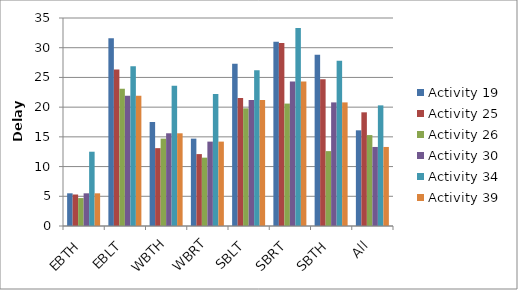
| Category | Activity 19 | Activity 25 | Activity 26 | Activity 30 | Activity 34 | Activity 39 |
|---|---|---|---|---|---|---|
| EBTH | 5.5 | 5.3 | 4.7 | 5.5 | 12.5 | 5.5 |
| EBLT | 31.6 | 26.35 | 23.1 | 21.9 | 26.9 | 21.9 |
| WBTH | 17.5 | 13.1 | 14.7 | 15.6 | 23.6 | 15.6 |
| WBRT | 14.7 | 12.1 | 11.5 | 14.2 | 22.2 | 14.2 |
| SBLT | 27.3 | 21.55 | 19.8 | 21.2 | 26.2 | 21.2 |
| SBRT | 31 | 30.8 | 20.6 | 24.3 | 33.3 | 24.3 |
| SBTH | 28.8 | 24.7 | 12.6 | 20.8 | 27.8 | 20.8 |
| All | 16.1 | 19.129 | 15.3 | 13.3 | 20.3 | 13.3 |